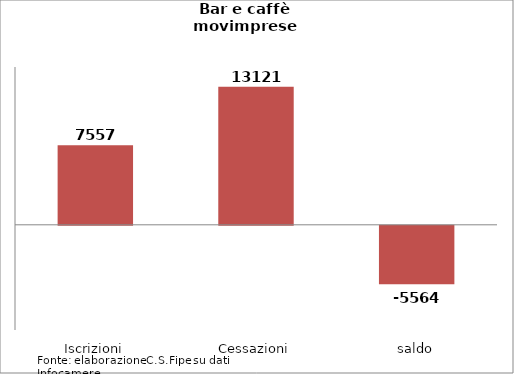
| Category | Series 0 |
|---|---|
| Iscrizioni | 7557 |
| Cessazioni | 13121 |
| saldo | -5564 |